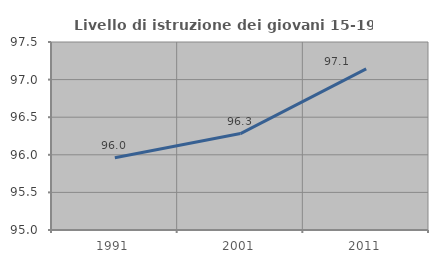
| Category | Livello di istruzione dei giovani 15-19 anni |
|---|---|
| 1991.0 | 95.96 |
| 2001.0 | 96.283 |
| 2011.0 | 97.143 |